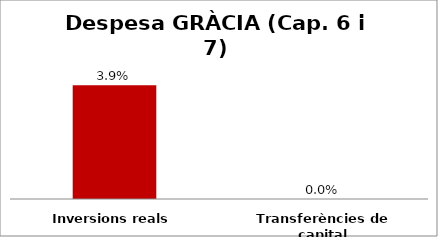
| Category | Series 0 |
|---|---|
| Inversions reals | 0.039 |
| Transferències de capital | 0 |